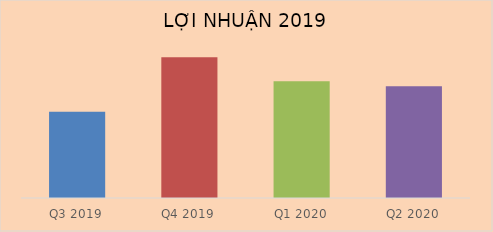
| Category | Doanh thu thuần |
|---|---|
| Q3 2019 | 5107640684364 |
| Q4 2019 | 8327364000000 |
| Q1 2020 | 6916416000000 |
| Q2 2020 | 6617340000000 |